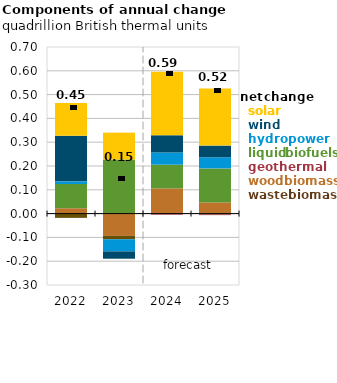
| Category | Wood biomass | Other biomass | Geothermal | Liquid biofuels | Hydropower | Wind power | Solar |
|---|---|---|---|---|---|---|---|
| 2022.0 | 0.022 | -0.018 | 0 | 0.102 | 0.011 | 0.191 | 0.138 |
| 2023.0 | -0.094 | -0.014 | 0.001 | 0.226 | -0.051 | -0.031 | 0.113 |
| 2024.0 | 0.106 | -0.002 | -0.003 | 0.1 | 0.051 | 0.072 | 0.267 |
| 2025.0 | 0.047 | -0.004 | -0.003 | 0.143 | 0.047 | 0.049 | 0.24 |